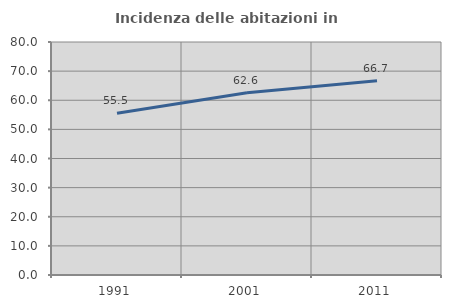
| Category | Incidenza delle abitazioni in proprietà  |
|---|---|
| 1991.0 | 55.52 |
| 2001.0 | 62.592 |
| 2011.0 | 66.713 |